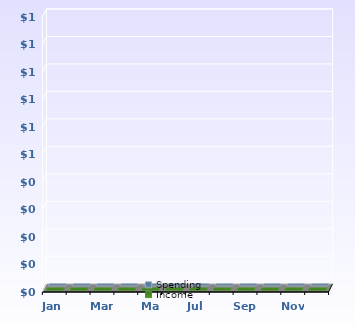
| Category | Spending | Income |
|---|---|---|
| Jan | 0 | 0 |
| Feb | 0 | 0 |
| Mar | 0 | 0 |
| Apr | 0 | 0 |
| May | 0 | 0 |
| Jun | 0 | 0 |
| Jul | 0 | 0 |
| Aug | 0 | 0 |
| Sep | 0 | 0 |
| Oct | 0 | 0 |
| Nov | 0 | 0 |
| Dec | 0 | 0 |